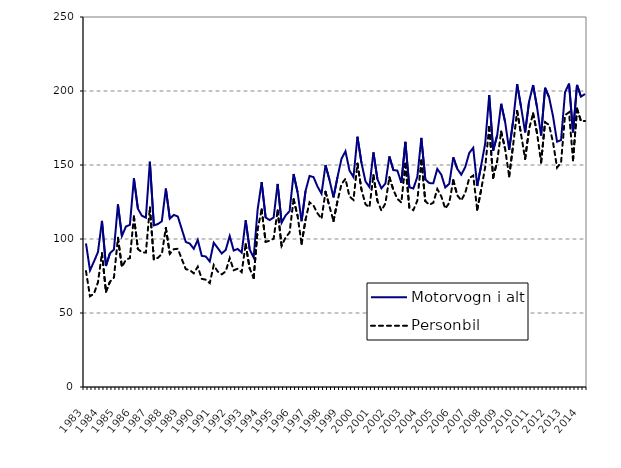
| Category | Motorvogn i alt | Personbil |
|---|---|---|
| 1983.0 | 97 | 78.3 |
| nan | 78.8 | 61.3 |
| nan | 84.8 | 63 |
| nan | 91.2 | 70.8 |
| 1984.0 | 112.2 | 90.4 |
| nan | 81.8 | 64.4 |
| nan | 90.4 | 71.1 |
| nan | 92.9 | 73.9 |
| 1985.0 | 123.4 | 100.8 |
| nan | 102 | 81.1 |
| nan | 108.4 | 86 |
| nan | 109.6 | 87.1 |
| 1986.0 | 141 | 115.2 |
| nan | 120.5 | 93.2 |
| nan | 115.7 | 91.1 |
| nan | 114.4 | 90.8 |
| 1987.0 | 152.2 | 121.3 |
| nan | 109.2 | 86.1 |
| nan | 110.1 | 87.3 |
| nan | 112 | 89.8 |
| 1988.0 | 134.1 | 107.5 |
| nan | 113.7 | 90 |
| nan | 116.3 | 93.1 |
| nan | 115.2 | 93.4 |
| 1989.0 | 106.6 | 86.4 |
| nan | 98 | 79.6 |
| nan | 96.9 | 79 |
| nan | 93.4 | 76.8 |
| 1990.0 | 99.4 | 81.3 |
| nan | 88.6 | 73.1 |
| nan | 88.2 | 72.5 |
| nan | 84.8 | 70.2 |
| 1991.0 | 97.5 | 82.4 |
| nan | 93.9 | 78 |
| nan | 90.2 | 76.1 |
| nan | 92.6 | 78.1 |
| 1992.0 | 102 | 87.1 |
| nan | 92.2 | 78.9 |
| nan | 93.3 | 79.9 |
| nan | 90.8 | 77.6 |
| 1993.0 | 112.6 | 96.5 |
| nan | 93 | 80.1 |
| nan | 87.5 | 73.6 |
| nan | 120.1 | 106.6 |
| 1994.0 | 138.4 | 120 |
| nan | 114.5 | 98.1 |
| nan | 112.8 | 98.8 |
| nan | 114.5 | 100.2 |
| 1995.0 | 137.2 | 119.3 |
| nan | 111 | 95.4 |
| nan | 115.9 | 101 |
| nan | 118.8 | 104.4 |
| 1996.0 | 143.9 | 126.9 |
| nan | 131.6 | 115.7 |
| nan | 112 | 96.7 |
| nan | 132.5 | 113.1 |
| 1997.0 | 142.6 | 124.8 |
| nan | 141.8 | 122.5 |
| nan | 135.4 | 117.3 |
| nan | 130.6 | 113.7 |
| 1998.0 | 150 | 131.9 |
| nan | 139.8 | 122 |
| nan | 128.1 | 112.1 |
| nan | 141.8 | 125.6 |
| 1999.0 | 154.2 | 137.1 |
| nan | 159.3 | 140.7 |
| nan | 146.3 | 128.7 |
| nan | 141.9 | 126.4 |
| 2000.0 | 169.1 | 150.9 |
| nan | 151.5 | 133.4 |
| nan | 139 | 123.5 |
| nan | 135.1 | 121.4 |
| 2001.0 | 158.5 | 143.1 |
| nan | 140.46 | 125.7 |
| nan | 134.24 | 119.2 |
| nan | 137.495 | 124.072 |
| 2002.0 | 155.814 | 141.724 |
| nan | 146.543 | 133.19 |
| nan | 146.231 | 127.141 |
| nan | 137.967 | 124.641 |
| 2003.0 | 165.679 | 150.811 |
| nan | 135.021 | 121.101 |
| nan | 134.111 | 119.491 |
| nan | 142.013 | 125.959 |
| 2004.0 | 168.309 | 153.043 |
| nan | 140.267 | 125.568 |
| nan | 137.77 | 123.121 |
| nan | 137.685 | 124.506 |
| 2005.0 | 147.311 | 133.756 |
| nan | 143.517 | 128.79 |
| nan | 134.783 | 120.571 |
| nan | 137.37 | 124.382 |
| 2006.0 | 155.213 | 139.728 |
| nan | 147.444 | 129.572 |
| nan | 143.451 | 126.006 |
| nan | 148.561 | 131.195 |
| 2007.0 | 158.1 | 141.084 |
| nan | 161.613 | 142.897 |
| nan | 135.821 | 119.753 |
| nan | 149.791 | 133.498 |
| 2008.0 | 164.642 | 148.614 |
| nan | 197.287 | 175.714 |
| nan | 159.718 | 141.407 |
| nan | 170.057 | 152.54 |
| 2009.0 | 191.38 | 172.559 |
| nan | 178.906 | 160.765 |
| nan | 160.234 | 142.312 |
| nan | 179.857 | 163.532 |
| 2010.0 | 204.636 | 186.507 |
| nan | 188.957 | 170.463 |
| nan | 172.077 | 154.156 |
| nan | 192.961 | 174.399 |
| 2011.0 | 204.005 | 184.86 |
| nan | 188.741 | 171.333 |
| nan | 169.934 | 151.694 |
| nan | 202.176 | 178.919 |
| 2012.0 | 195.829 | 177.072 |
| nan | 182.751 | 165.128 |
| nan | 165.73 | 148.242 |
| nan | 166.805 | 151.728 |
| 2013.0 | 199.181 | 183.653 |
| nan | 205.015 | 185.634 |
| nan | 172.044 | 153.21 |
| nan | 204.1 | 188.079 |
| 2014.0 | 196.177 | 179.552 |
| nan | 197.965 | 179.767 |